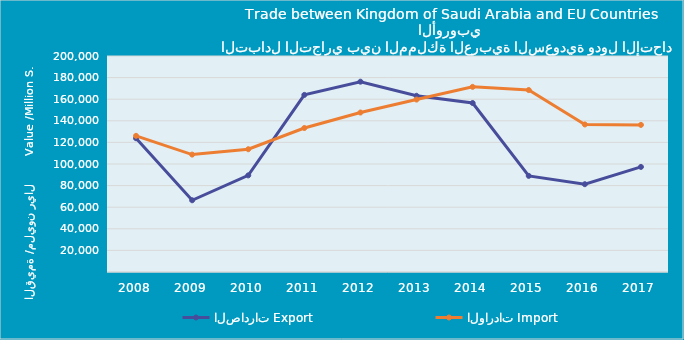
| Category | الصادرات | الواردات |
|---|---|---|
| 2008.0 | 123842358569 | 126076788324 |
| 2009.0 | 66424449943 | 108706870724 |
| 2010.0 | 89473272822 | 113673694057 |
| 2011.0 | 163984710171 | 133338217916 |
| 2012.0 | 176214374025 | 147655229181 |
| 2013.0 | 163153758917 | 159668962902 |
| 2014.0 | 156468256094 | 171440173149 |
| 2015.0 | 88997074905 | 168482820598 |
| 2016.0 | 81310614558 | 136611121499 |
| 2017.0 | 97297815008 | 136211429633 |